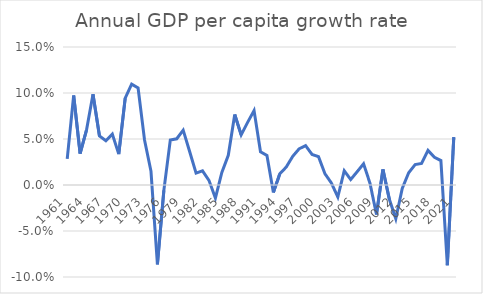
| Category | Annual GDP per capita growth rate |
|---|---|
| 1961.0 | 0.028 |
| 1962.0 | 0.097 |
| 1963.0 | 0.034 |
| 1964.0 | 0.06 |
| 1965.0 | 0.099 |
| 1966.0 | 0.053 |
| 1967.0 | 0.048 |
| 1968.0 | 0.055 |
| 1969.0 | 0.034 |
| 1970.0 | 0.094 |
| 1971.0 | 0.11 |
| 1972.0 | 0.105 |
| 1973.0 | 0.049 |
| 1974.0 | 0.015 |
| 1975.0 | -0.086 |
| 1976.0 | -0.006 |
| 1977.0 | 0.049 |
| 1978.0 | 0.05 |
| 1979.0 | 0.06 |
| 1980.0 | 0.036 |
| 1981.0 | 0.013 |
| 1982.0 | 0.015 |
| 1983.0 | 0.005 |
| 1984.0 | -0.014 |
| 1985.0 | 0.014 |
| 1986.0 | 0.032 |
| 1987.0 | 0.077 |
| 1988.0 | 0.054 |
| 1989.0 | 0.068 |
| 1990.0 | 0.081 |
| 1991.0 | 0.036 |
| 1992.0 | 0.032 |
| 1993.0 | -0.008 |
| 1994.0 | 0.012 |
| 1995.0 | 0.02 |
| 1996.0 | 0.031 |
| 1997.0 | 0.039 |
| 1998.0 | 0.043 |
| 1999.0 | 0.033 |
| 2000.0 | 0.031 |
| 2001.0 | 0.012 |
| 2002.0 | 0.002 |
| 2003.0 | -0.013 |
| 2004.0 | 0.015 |
| 2005.0 | 0.006 |
| 2006.0 | 0.014 |
| 2007.0 | 0.023 |
| 2008.0 | 0.002 |
| 2009.0 | -0.032 |
| 2010.0 | 0.017 |
| 2011.0 | -0.016 |
| 2012.0 | -0.037 |
| 2013.0 | -0.004 |
| 2014.0 | 0.013 |
| 2015.0 | 0.022 |
| 2016.0 | 0.023 |
| 2017.0 | 0.038 |
| 2018.0 | 0.03 |
| 2019.0 | 0.027 |
| 2020.0 | -0.087 |
| 2021.0 | 0.052 |